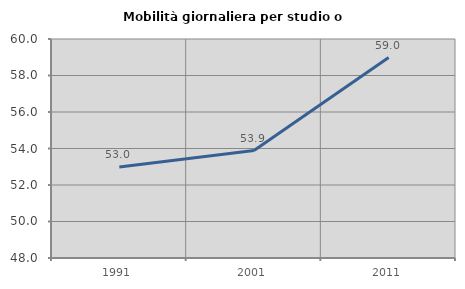
| Category | Mobilità giornaliera per studio o lavoro |
|---|---|
| 1991.0 | 52.984 |
| 2001.0 | 53.889 |
| 2011.0 | 58.983 |